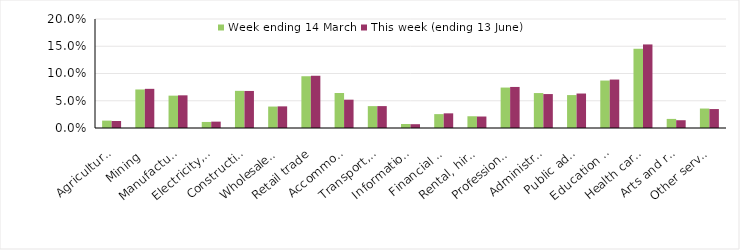
| Category | Week ending 14 March | This week (ending 13 June) |
|---|---|---|
| Agriculture, forestry and fishing | 0.014 | 0.013 |
| Mining | 0.071 | 0.072 |
| Manufacturing | 0.059 | 0.06 |
| Electricity, gas, water and waste services | 0.011 | 0.012 |
| Construction | 0.068 | 0.068 |
| Wholesale trade | 0.039 | 0.04 |
| Retail trade | 0.095 | 0.096 |
| Accommodation and food services | 0.064 | 0.052 |
| Transport, postal and warehousing | 0.04 | 0.04 |
| Information media and telecommunications | 0.007 | 0.007 |
| Financial and insurance services | 0.025 | 0.027 |
| Rental, hiring and real estate services | 0.022 | 0.021 |
| Professional, scientific and technical services | 0.074 | 0.075 |
| Administrative and support services | 0.064 | 0.062 |
| Public administration and safety | 0.06 | 0.063 |
| Education and training | 0.087 | 0.089 |
| Health care and social assistance | 0.145 | 0.153 |
| Arts and recreation services | 0.017 | 0.014 |
| Other services | 0.036 | 0.035 |